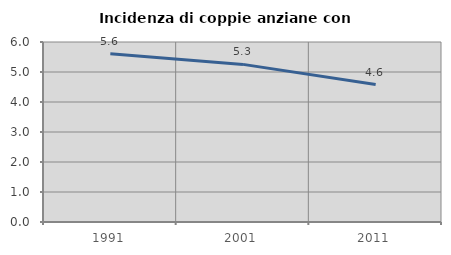
| Category | Incidenza di coppie anziane con figli |
|---|---|
| 1991.0 | 5.609 |
| 2001.0 | 5.254 |
| 2011.0 | 4.583 |